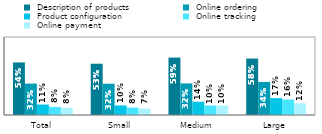
| Category |  Description of products |  Online ordering |  Product configuration |  Online tracking |  Online payment |
|---|---|---|---|---|---|
| Total | 0.539 | 0.322 | 0.107 | 0.083 | 0.075 |
| Small | 0.526 | 0.321 | 0.098 | 0.076 | 0.067 |
| Medium | 0.589 | 0.324 | 0.136 | 0.097 | 0.097 |
| Large | 0.579 | 0.339 | 0.173 | 0.159 | 0.12 |